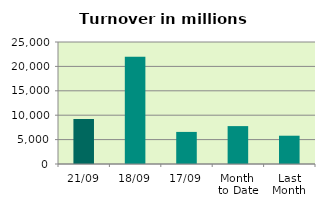
| Category | Series 0 |
|---|---|
| 21/09 | 9222.031 |
| 18/09 | 22001.846 |
| 17/09 | 6574.523 |
| Month 
to Date | 7764.77 |
| Last
Month | 5795.357 |